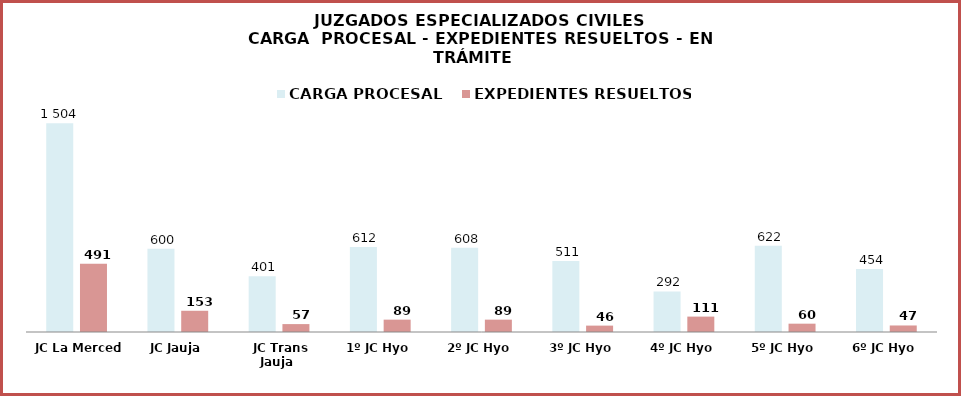
| Category | CARGA PROCESAL | EXPEDIENTES RESUELTOS |
|---|---|---|
| JC La Merced | 1504 | 491 |
| JC Jauja | 600 | 153 |
| JC Trans Jauja | 401 | 57 |
| 1º JC Hyo | 612 | 89 |
| 2º JC Hyo | 608 | 89 |
| 3º JC Hyo | 511 | 46 |
| 4º JC Hyo | 292 | 111 |
| 5º JC Hyo | 622 | 60 |
| 6º JC Hyo | 454 | 47 |